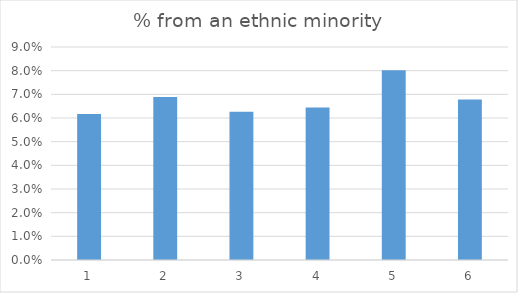
| Category | % from an ethnic minority |
|---|---|
| 0 | 0.062 |
| 1 | 0.069 |
| 2 | 0.063 |
| 3 | 0.064 |
| 4 | 0.08 |
| 5 | 0.068 |